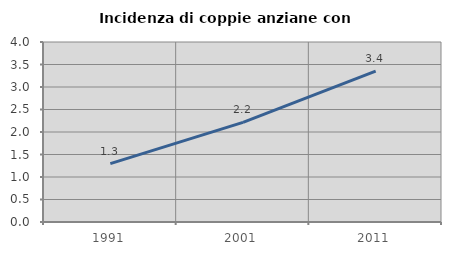
| Category | Incidenza di coppie anziane con figli |
|---|---|
| 1991.0 | 1.297 |
| 2001.0 | 2.213 |
| 2011.0 | 3.351 |